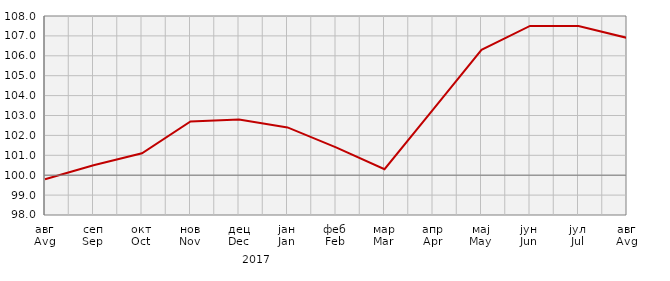
| Category | Индекси цијена произвођача
Producer price indices |
|---|---|
| авг
Avg | 99.8 |
| сеп
Sep | 100.5 |
| окт
Oct | 101.1 |
| нов
Nov | 102.7 |
| дец
Dec | 102.8 |
| јан
Jan | 102.4 |
| феб
Feb | 101.4 |
| мар
Mar | 100.3 |
| апр
Apr | 103.3 |
| мај
May | 106.3 |
| јун
Jun | 107.5 |
| јул
Jul | 107.5 |
| авг
Avg | 106.9 |